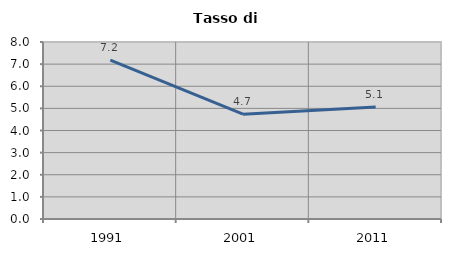
| Category | Tasso di disoccupazione   |
|---|---|
| 1991.0 | 7.177 |
| 2001.0 | 4.738 |
| 2011.0 | 5.066 |